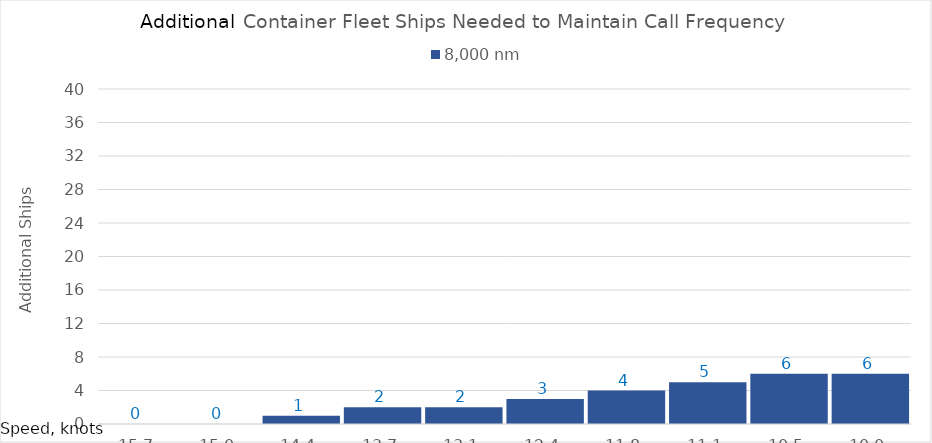
| Category | 8,000 |
|---|---|
| 15.65 | 0 |
| 15.0 | 0 |
| 14.35 | 1 |
| 13.7 | 2 |
| 13.049999999999999 | 2 |
| 12.399999999999999 | 3 |
| 11.749999999999998 | 4 |
| 11.099999999999998 | 5 |
| 10.449999999999998 | 6 |
| 10.0 | 6 |